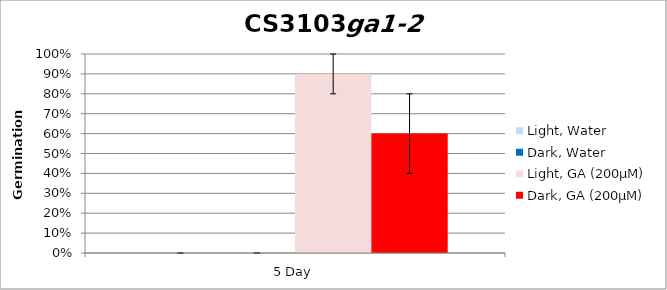
| Category | Light, Water | Dark, Water | Light, GA (200µM) | Dark, GA (200µM) |
|---|---|---|---|---|
| 5 Day | 0 | 0 | 0.9 | 0.6 |